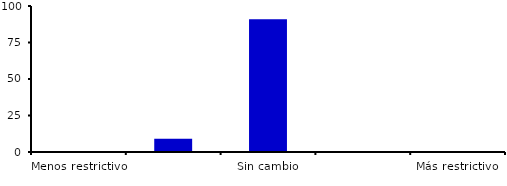
| Category | Series 0 |
|---|---|
| Menos restrictivo | 0 |
| Moderadamente menos restrictivo | 9.091 |
| Sin cambio | 90.909 |
| Moderadamente más restrictivo | 0 |
| Más restrictivo | 0 |